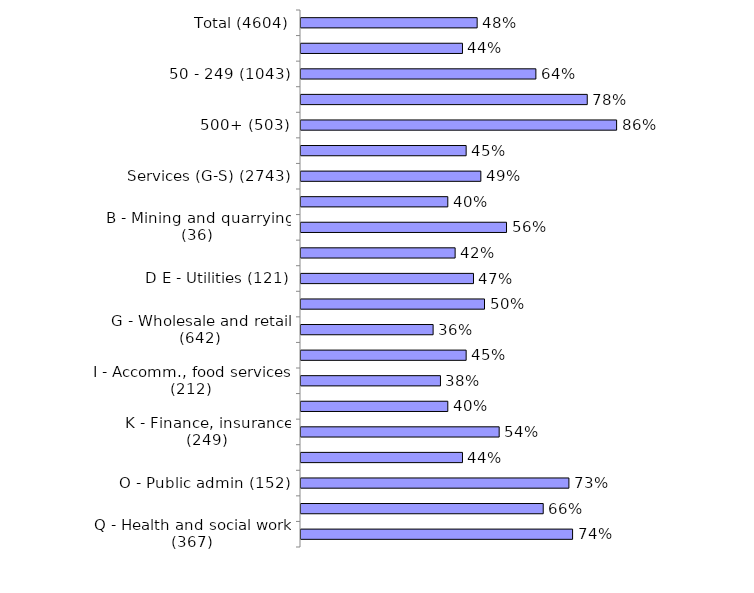
| Category | Series 0 |
|---|---|
| Total (4604) | 0.48 |
| 10-49 (2678) | 0.44 |
| 50 - 249 (1043) | 0.64 |
| 250 - 499 (380) | 0.78 |
| 500+ (503) | 0.86 |
| Production (A-F) (1861) | 0.45 |
| Services (G-S) (2743) | 0.49 |
| A - Agriculture (135) | 0.4 |
| B - Mining and quarrying (36) | 0.56 |
| C - Manufacturing (1396) | 0.42 |
| D E - Utilities (121) | 0.47 |
| F - Construction (173) | 0.5 |
| G - Wholesale and retail (642) | 0.36 |
| H - Transport , storage (203) | 0.45 |
| I - Accomm., food services (212) | 0.38 |
| J - Information, comms (170) | 0.4 |
| K - Finance, insurance (249) | 0.54 |
| LMNRS - Bus/tech/admin/arts/other (366) | 0.44 |
| O - Public admin (152) | 0.73 |
| P - Education (382) | 0.66 |
| Q - Health and social work (367) | 0.74 |